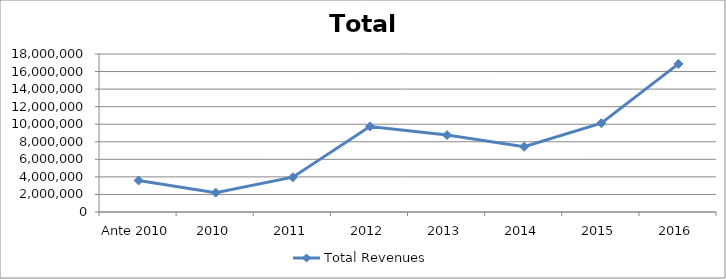
| Category | Total Revenues |
|---|---|
| Ante 2010 | 3592750 |
| 2010 | 2201300 |
| 2011 | 3964071 |
| 2012 | 9745037 |
| 2013 | 8762139.063 |
| 2014 | 7432465.557 |
| 2015 | 10120163.694 |
| 2016 | 16868751.668 |